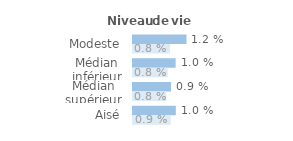
| Category | Series 1 | Series 0 |
|---|---|---|
| Modeste | 0.012 | 0.008 |
| Médian inférieur | 0.01 | 0.008 |
| Médian supérieur | 0.009 | 0.008 |
| Aisé | 0.01 | 0.009 |